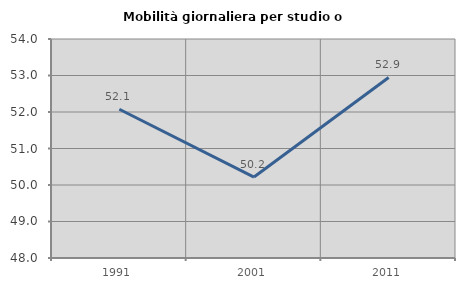
| Category | Mobilità giornaliera per studio o lavoro |
|---|---|
| 1991.0 | 52.075 |
| 2001.0 | 50.217 |
| 2011.0 | 52.947 |